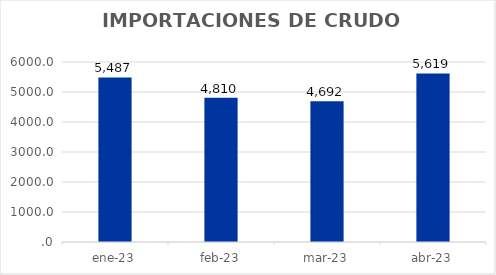
| Category | IMPORTACIONES DE CRUDO |
|---|---|
| ene-23 | 5487.306 |
| feb-23 | 4809.882 |
| mar-23 | 4692.058 |
| abr-23 | 5619.31 |